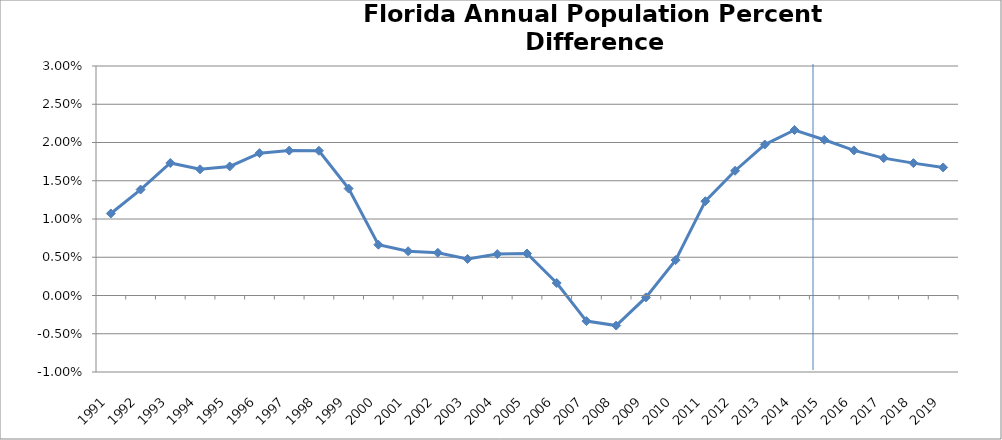
| Category | Difference |
|---|---|
| 1991-01-01 | 0.011 |
| 1992-01-01 | 0.014 |
| 1993-01-01 | 0.017 |
| 1994-01-01 | 0.016 |
| 1995-01-01 | 0.017 |
| 1996-01-01 | 0.019 |
| 1997-01-01 | 0.019 |
| 1998-01-01 | 0.019 |
| 1999-01-01 | 0.014 |
| 2000-01-01 | 0.007 |
| 2001-01-01 | 0.006 |
| 2002-01-01 | 0.006 |
| 2003-01-01 | 0.005 |
| 2004-01-01 | 0.005 |
| 2005-01-01 | 0.005 |
| 2006-01-01 | 0.002 |
| 2007-01-01 | -0.003 |
| 2008-01-01 | -0.004 |
| 2009-01-01 | 0 |
| 2010-01-01 | 0.005 |
| 2011-01-01 | 0.012 |
| 2012-01-01 | 0.016 |
| 2013-01-01 | 0.02 |
| 2014-01-01 | 0.022 |
| 2015-01-01 | 0.02 |
| 2016-01-01 | 0.019 |
| 2017-01-01 | 0.018 |
| 2018-01-01 | 0.017 |
| 2019-01-01 | 0.017 |